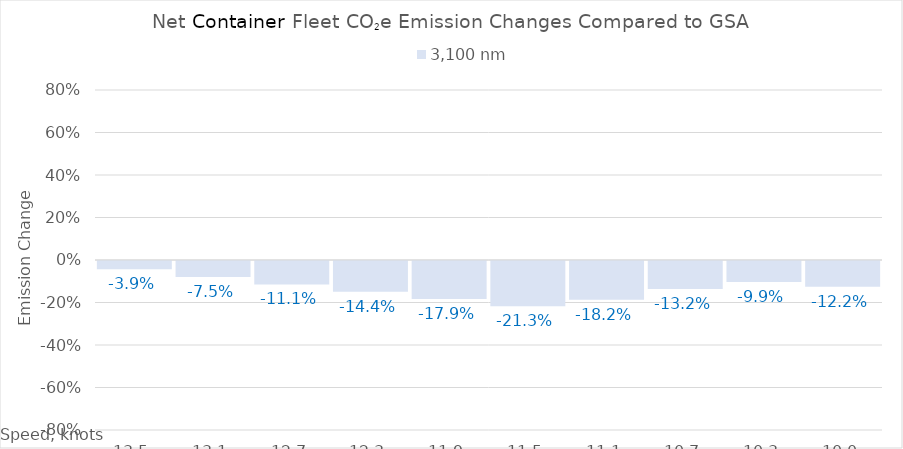
| Category | 3,100 |
|---|---|
| 13.5 | -0.039 |
| 13.1 | -0.075 |
| 12.7 | -0.111 |
| 12.299999999999999 | -0.144 |
| 11.899999999999999 | -0.179 |
| 11.499999999999998 | -0.213 |
| 11.099999999999998 | -0.182 |
| 10.699999999999998 | -0.132 |
| 10.299999999999997 | -0.099 |
| 10.0 | -0.122 |